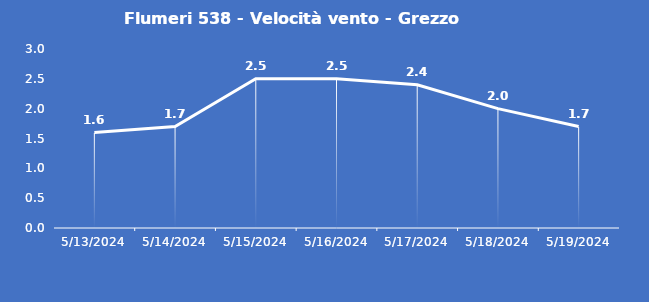
| Category | Flumeri 538 - Velocità vento - Grezzo (m/s) |
|---|---|
| 5/13/24 | 1.6 |
| 5/14/24 | 1.7 |
| 5/15/24 | 2.5 |
| 5/16/24 | 2.5 |
| 5/17/24 | 2.4 |
| 5/18/24 | 2 |
| 5/19/24 | 1.7 |